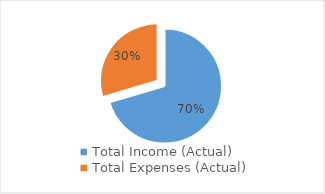
| Category | Series 0 |
|---|---|
| Total Income (Actual) | 6250 |
| Total Expenses (Actual) | 2630 |